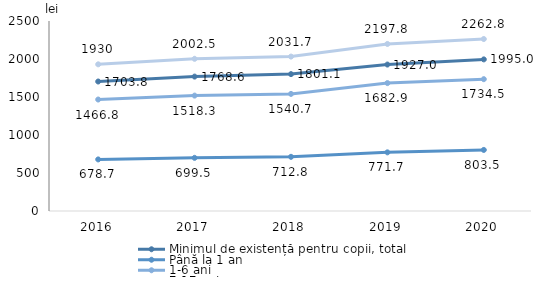
| Category | Minimul de existență pentru copii, total | Până la 1 an | 1-6 ani | 7-17 ani |
|---|---|---|---|---|
| 2016.0 | 1703.8 | 678.7 | 1466.8 | 1930 |
| 2017.0 | 1768.6 | 699.5 | 1518.3 | 2002.5 |
| 2018.0 | 1801.1 | 712.8 | 1540.7 | 2031.7 |
| 2019.0 | 1927 | 771.7 | 1682.9 | 2197.8 |
| 2020.0 | 1995 | 803.5 | 1734.5 | 2262.8 |